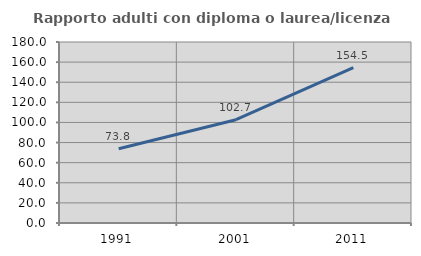
| Category | Rapporto adulti con diploma o laurea/licenza media  |
|---|---|
| 1991.0 | 73.784 |
| 2001.0 | 102.736 |
| 2011.0 | 154.514 |